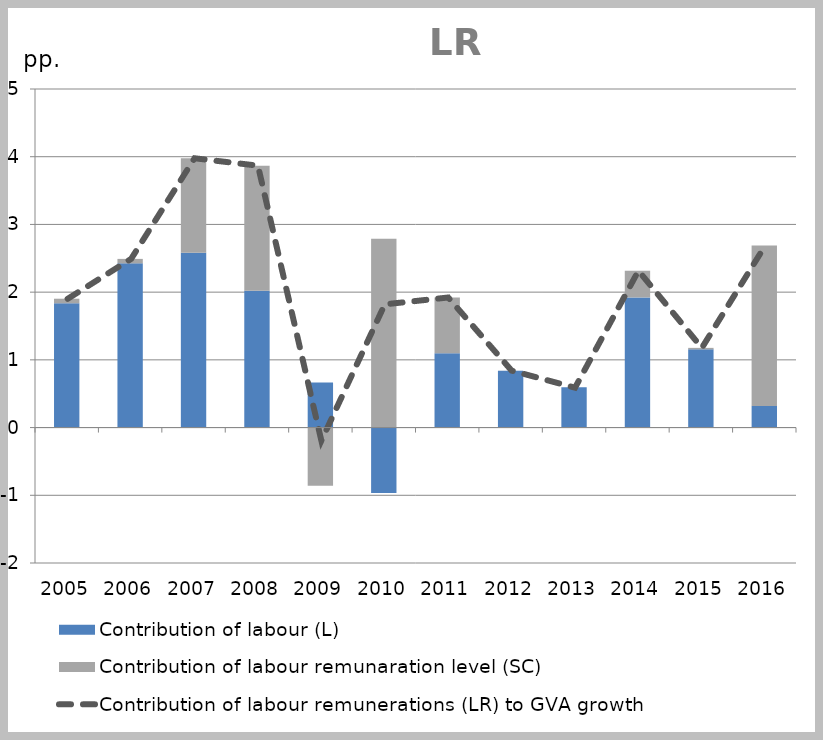
| Category | Contribution of labour (L) | Contribution of labour remunaration level (SC) |
|---|---|---|
| 2005.0 | 1.836 | 0.067 |
| 2006.0 | 2.425 | 0.066 |
| 2007.0 | 2.58 | 1.397 |
| 2008.0 | 2.019 | 1.849 |
| 2009.0 | 0.665 | -0.859 |
| 2010.0 | -0.968 | 2.787 |
| 2011.0 | 1.097 | 0.824 |
| 2012.0 | 0.84 | 0.001 |
| 2013.0 | 0.595 | -0.006 |
| 2014.0 | 1.922 | 0.394 |
| 2015.0 | 1.155 | 0.022 |
| 2016.0 | 0.32 | 2.37 |